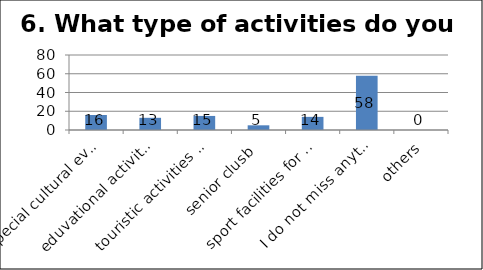
| Category | Series 0 |
|---|---|
| special cultural events for seniors | 16 |
| eduvational activities for seniors | 13 |
| touristic activities for seniors | 15 |
| senior clusb | 5 |
| sport facilities for seniors | 14 |
| I do not miss anything | 58 |
| others | 0 |